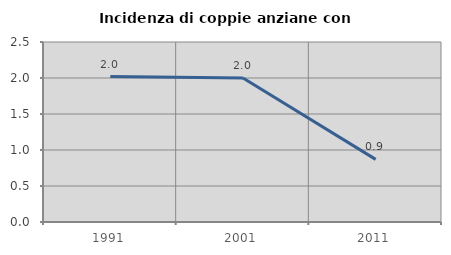
| Category | Incidenza di coppie anziane con figli |
|---|---|
| 1991.0 | 2.02 |
| 2001.0 | 2 |
| 2011.0 | 0.87 |